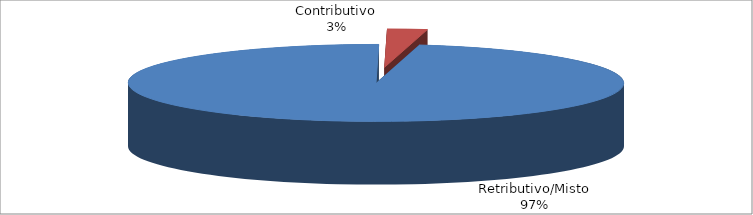
| Category | Decorrenti ANNO 2022 |
|---|---|
| Retributivo/Misto | 113908 |
| Contributivo | 3044 |